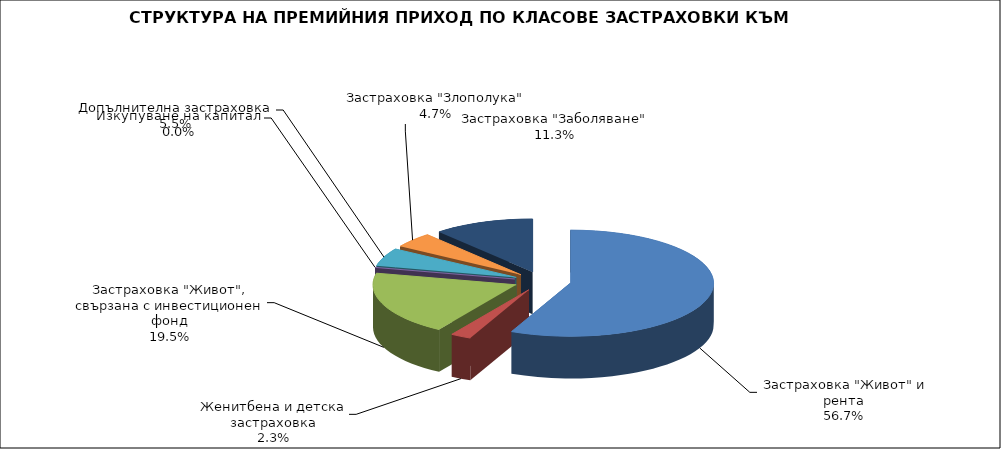
| Category |  Застраховка "Живот" и рента |
|---|---|
|  Застраховка "Живот" и рента | 127336798.211 |
| Женитбена и детска застраховка | 5240599.914 |
| Застраховка "Живот", свързана с инвестиционен фонд | 43692154.478 |
| Изкупуване на капитал | 0 |
| Допълнителна застраховка | 12317240.293 |
| Застраховка "Злополука" | 10449618.9 |
| Застраховка "Заболяване" | 25457955.655 |